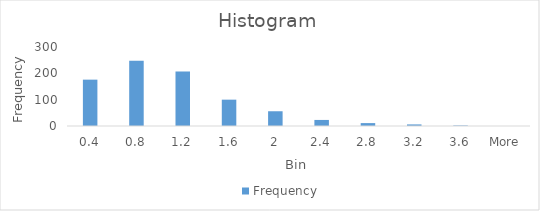
| Category | Frequency |
|---|---|
| 0.4 | 176 |
| 0.8 | 248 |
| 1.2 | 207 |
| 1.6 | 100 |
| 2 | 56 |
| 2.4 | 23 |
| 2.8 | 11 |
| 3.2 | 6 |
| 3.6 | 2 |
| More | 0 |